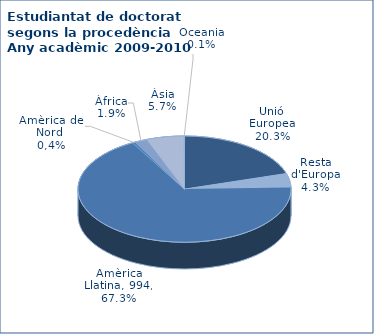
| Category | 2009-2010 |
|---|---|
| Unió Europea | 299 |
| Resta d'Europa | 63 |
| Amèrica Llatina | 994 |
| Amèrica del Nord (1) | 7 |
| Àfrica | 28 |
| Àsia | 84 |
| Oceania | 1 |